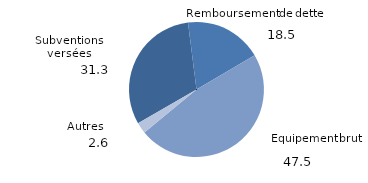
| Category | Series 0 |
|---|---|
| 0 | 31.324 |
| 1 | 18.511 |
| 2 | 47.535 |
| 3 | 2.631 |